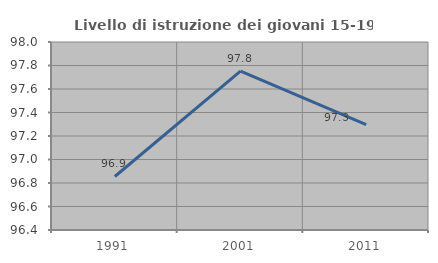
| Category | Livello di istruzione dei giovani 15-19 anni |
|---|---|
| 1991.0 | 96.855 |
| 2001.0 | 97.753 |
| 2011.0 | 97.297 |